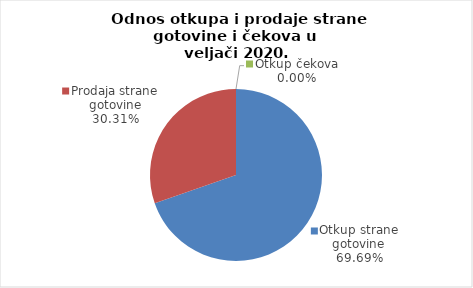
| Category | Series 0 |
|---|---|
| Otkup strane gotovine | 69.693 |
| Prodaja strane gotovine | 30.307 |
| Otkup čekova | 0 |